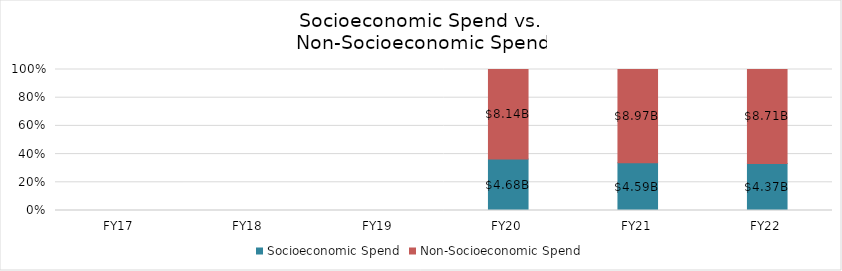
| Category | Socioeconomic Spend | Non-Socioeconomic Spend |
|---|---|---|
| FY17 | 0 | 0 |
| FY18 | 0 | 0 |
| FY19 | 0 | 0 |
| FY20 | 4675884239.531 | 8142664137.349 |
| FY21 | 4591189388.591 | 8966435843.349 |
| FY22 | 4365277562 | 8706747581.2 |